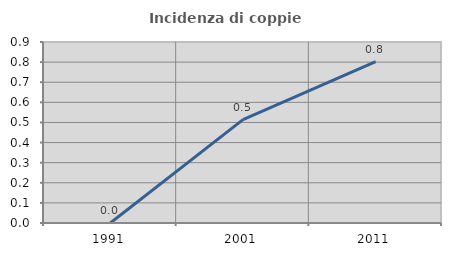
| Category | Incidenza di coppie miste |
|---|---|
| 1991.0 | 0 |
| 2001.0 | 0.514 |
| 2011.0 | 0.802 |